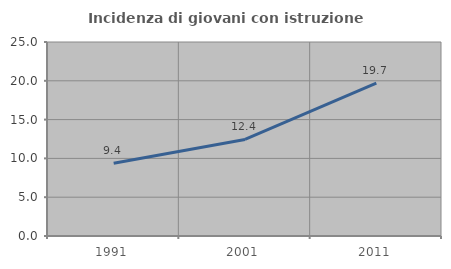
| Category | Incidenza di giovani con istruzione universitaria |
|---|---|
| 1991.0 | 9.371 |
| 2001.0 | 12.448 |
| 2011.0 | 19.69 |